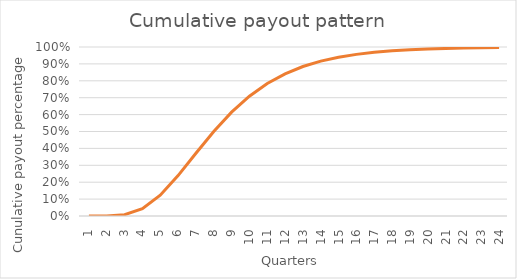
| Category | Payout pattern |
|---|---|
| 1.0 | 0 |
| 2.0 | 0 |
| 3.0 | 0.008 |
| 4.0 | 0.044 |
| 5.0 | 0.123 |
| 6.0 | 0.239 |
| 7.0 | 0.371 |
| 8.0 | 0.5 |
| 9.0 | 0.614 |
| 10.0 | 0.709 |
| 11.0 | 0.784 |
| 12.0 | 0.841 |
| 13.0 | 0.884 |
| 14.0 | 0.916 |
| 15.0 | 0.939 |
| 16.0 | 0.956 |
| 17.0 | 0.968 |
| 18.0 | 0.977 |
| 19.0 | 0.984 |
| 20.0 | 0.988 |
| 21.0 | 0.991 |
| 22.0 | 0.994 |
| 23.0 | 0.995 |
| 24.0 | 0.997 |